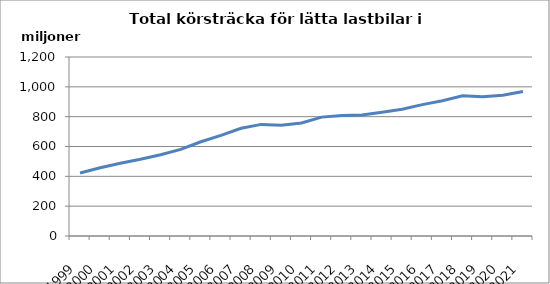
| Category | Series 0 |
|---|---|
| 1999.0 | 422257663.4 |
| 2000.0 | 457395257.8 |
| 2001.0 | 488193162.8 |
| 2002.0 | 514755393.5 |
| 2003.0 | 545141383.5 |
| 2004.0 | 580338676.2 |
| 2005.0 | 631604271.8 |
| 2006.0 | 674180412.5 |
| 2007.0 | 722000073.4 |
| 2008.0 | 748182703 |
| 2009.0 | 742110599.7 |
| 2010.0 | 757725514.2 |
| 2011.0 | 797023975 |
| 2012.0 | 808048451 |
| 2013.0 | 810917728 |
| 2014.0 | 830330963.4 |
| 2015.0 | 850273283.5 |
| 2016.0 | 880672465.6 |
| 2017.0 | 906673343.6 |
| 2018.0 | 939618081 |
| 2019.0 | 932735513 |
| 2020.0 | 943099242.2 |
| 2021.0 | 968735746 |